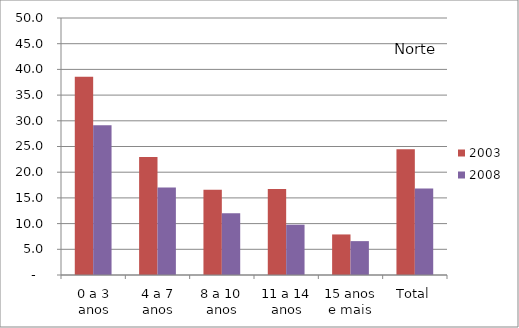
| Category | 2003 | 2008 |
|---|---|---|
| 0 a 3 anos | 38.57 | 29.15 |
| 4 a 7 anos | 22.97 | 17.04 |
| 8 a 10 anos | 16.57 | 12.02 |
| 11 a 14 anos | 16.74 | 9.79 |
| 15 anos e mais | 7.89 | 6.59 |
| Total | 24.47 | 16.85 |